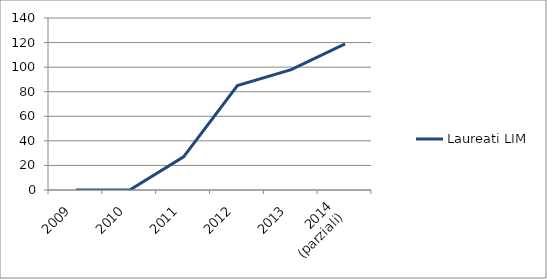
| Category | Laureati LIM |
|---|---|
| 2009 | 0 |
| 2010 | 0 |
| 2011 | 27 |
| 2012 | 85 |
| 2013 | 98 |
| 2014
(parziali) | 119 |